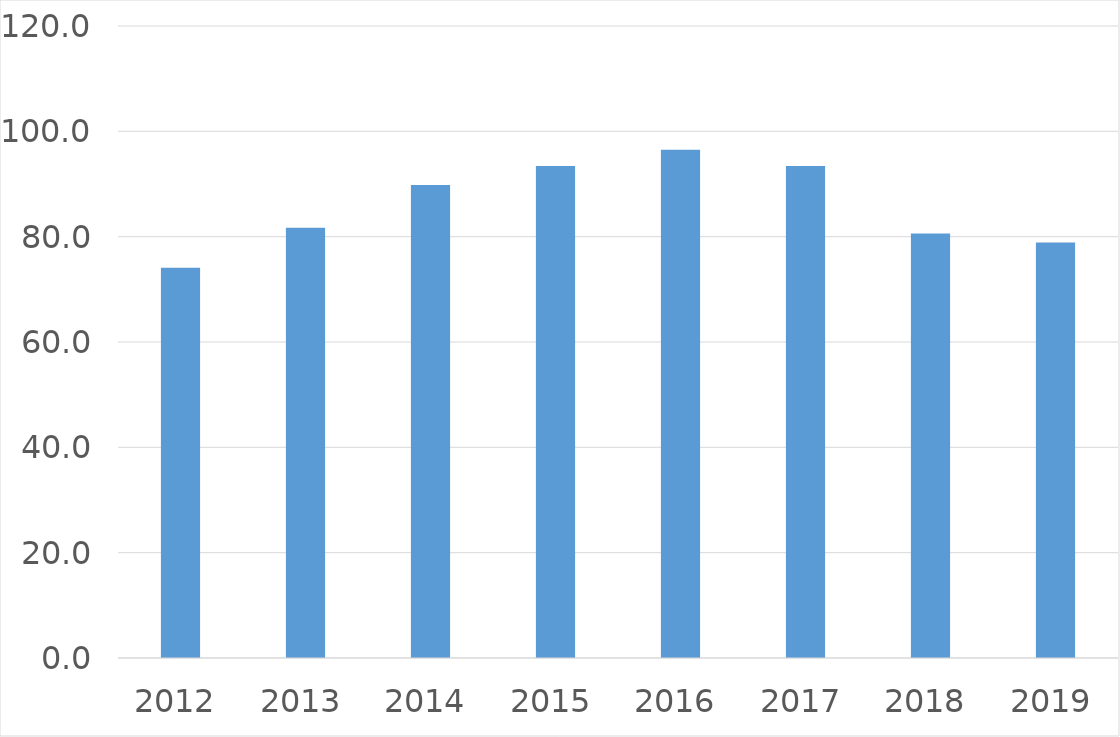
| Category | Series 0 |
|---|---|
| 2012 | 74.1 |
| 2013 | 81.7 |
| 2014 | 89.8 |
| 2015 | 93.4 |
| 2016 | 96.5 |
| 2017 | 93.4 |
| 2018 | 80.6 |
| 2019 | 78.9 |